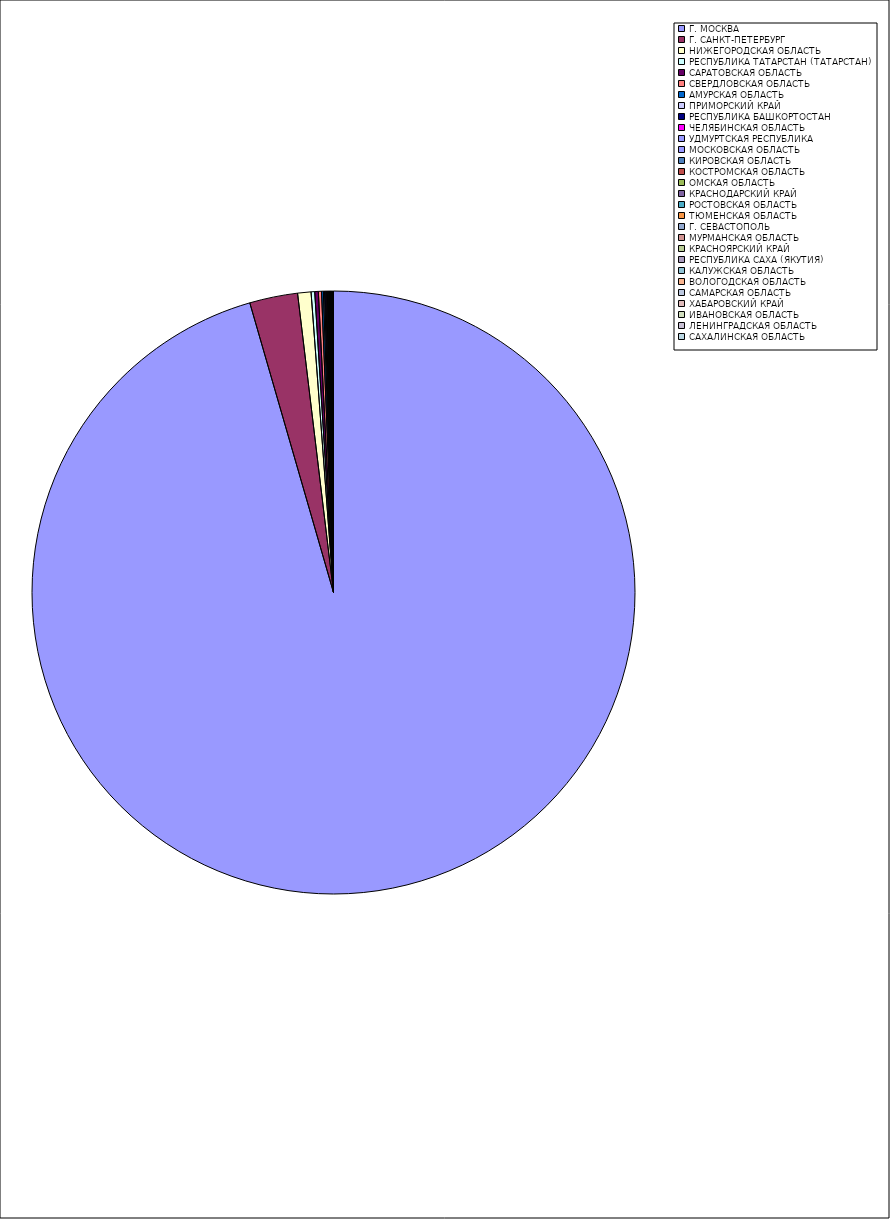
| Category | Оборот |
|---|---|
| Г. МОСКВА | 95.478 |
| Г. САНКТ-ПЕТЕРБУРГ | 2.573 |
| НИЖЕГОРОДСКАЯ ОБЛАСТЬ | 0.716 |
| РЕСПУБЛИКА ТАТАРСТАН (ТАТАРСТАН) | 0.194 |
| САРАТОВСКАЯ ОБЛАСТЬ | 0.192 |
| СВЕРДЛОВСКАЯ ОБЛАСТЬ | 0.168 |
| АМУРСКАЯ ОБЛАСТЬ | 0.098 |
| ПРИМОРСКИЙ КРАЙ | 0.063 |
| РЕСПУБЛИКА БАШКОРТОСТАН | 0.062 |
| ЧЕЛЯБИНСКАЯ ОБЛАСТЬ | 0.046 |
| УДМУРТСКАЯ РЕСПУБЛИКА | 0.04 |
| МОСКОВСКАЯ ОБЛАСТЬ | 0.037 |
| КИРОВСКАЯ ОБЛАСТЬ | 0.034 |
| КОСТРОМСКАЯ ОБЛАСТЬ | 0.033 |
| ОМСКАЯ ОБЛАСТЬ | 0.03 |
| КРАСНОДАРСКИЙ КРАЙ | 0.028 |
| РОСТОВСКАЯ ОБЛАСТЬ | 0.025 |
| ТЮМЕНСКАЯ ОБЛАСТЬ | 0.024 |
| Г. СЕВАСТОПОЛЬ | 0.015 |
| МУРМАНСКАЯ ОБЛАСТЬ | 0.014 |
| КРАСНОЯРСКИЙ КРАЙ | 0.014 |
| РЕСПУБЛИКА САХА (ЯКУТИЯ) | 0.013 |
| КАЛУЖСКАЯ ОБЛАСТЬ | 0.012 |
| ВОЛОГОДСКАЯ ОБЛАСТЬ | 0.009 |
| САМАРСКАЯ ОБЛАСТЬ | 0.008 |
| ХАБАРОВСКИЙ КРАЙ | 0.008 |
| ИВАНОВСКАЯ ОБЛАСТЬ | 0.007 |
| ЛЕНИНГРАДСКАЯ ОБЛАСТЬ | 0.007 |
| САХАЛИНСКАЯ ОБЛАСТЬ | 0.005 |